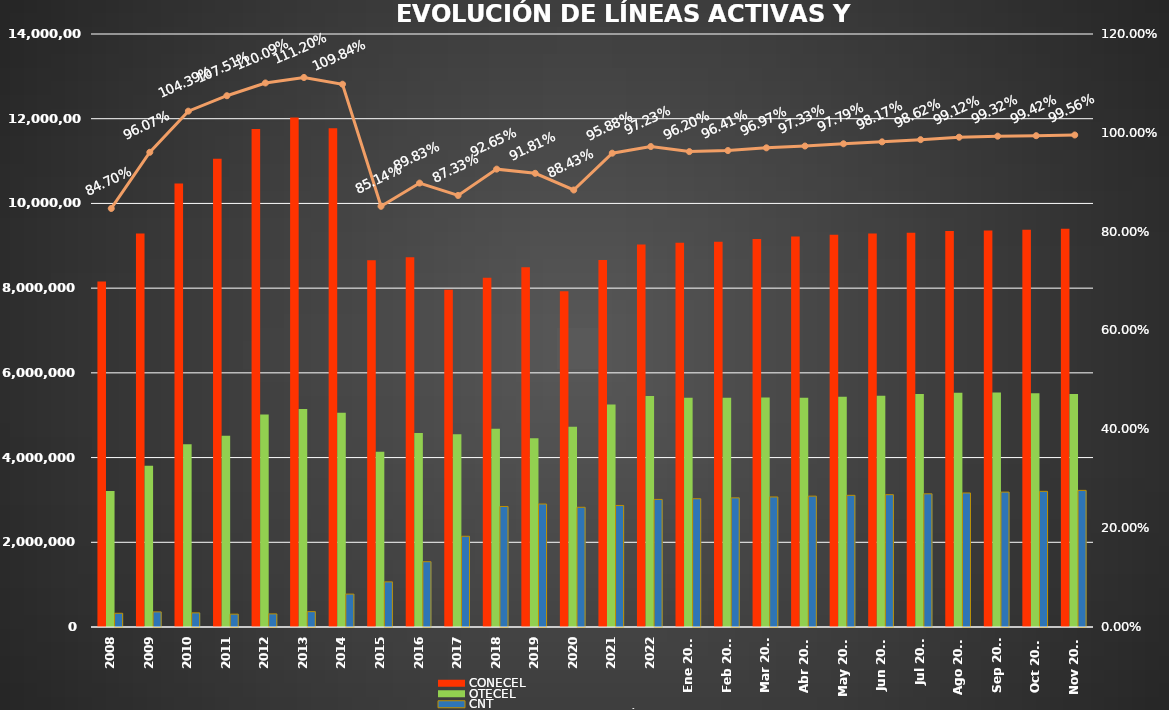
| Category | CONECEL | OTECEL | CNT |
|---|---|---|---|
| 2008 | 8156359 | 3211922 | 323967 |
| 2009 | 9291268 | 3806432 | 356900 |
| 2010 | 10470502 | 4314599 | 333730 |
| 2011 | 11057316 | 4513874 | 303368 |
| 2012 | 11757906 | 5019686 | 309271 |
| 2013 | 12030886 | 5148308 | 362560 |
| 2014 | 11772020 | 5055645 | 776892 |
| 2015 | 8658619 | 4134698 | 1065703 |
| 2016 | 8726823 | 4580092 | 1541219 |
| 2017 | 7960263 | 4549024 | 2142117 |
| 2018 | 8248050 | 4679646 | 2845142 |
| 2019 | 8493054 | 4456356 | 2903690 |
| 2020 | 7929253 | 4729725 | 2826388 |
| 2021 | 8665715 | 5254468 | 2869417 |
| 2022 | 9027737 | 5451115 | 3011899 |
| Ene 2023 | 9073421 | 5411860 | 3028254 |
| Feb 2023 | 9092490 | 5410682 | 3048837 |
| Mar 2023 | 9162562 | 5419670 | 3070611 |
| Abr 2023 | 9220042 | 5409581 | 3089410 |
| May 2023 | 9259499 | 5434175 | 3108405 |
| Jun 2023 | 9290231 | 5458655 | 3123905 |
| Jul 2023 | 9310350 | 5499232 | 3144067 |
| Ago 2023 | 9349530 | 5530451 | 3164614 |
| Sep 2023 | 9361007 | 5536629 | 3184663 |
| Oct 2023 | 9378363 | 5518632 | 3202774 |
| Nov 2023 | 9399776 | 5500199 | 3225513 |